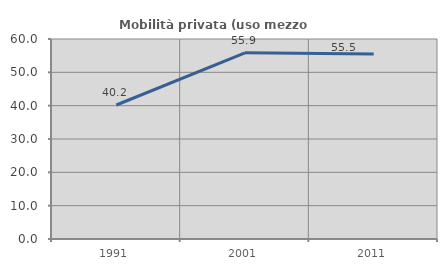
| Category | Mobilità privata (uso mezzo privato) |
|---|---|
| 1991.0 | 40.196 |
| 2001.0 | 55.851 |
| 2011.0 | 55.495 |